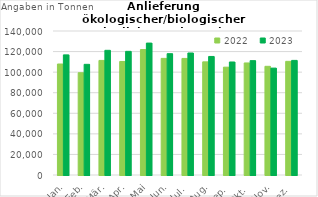
| Category | 2022 | 2023 |
|---|---|---|
| Jan. | 107909.282 | 116779.33 |
| Feb. | 99429.539 | 107594.545 |
| Mär. | 111392.152 | 121212.435 |
| Apr. | 110366.518 | 120208.989 |
| Mai | 121960.944 | 128253.711 |
| Jun. | 113379.179 | 117942.851 |
| Jul. | 113335.872 | 118612.122 |
| Aug. | 110008.158 | 115248.086 |
| Sep. | 104837.357 | 109871.811 |
| Okt. | 108927.433 | 111178.903 |
| Nov. | 105660.311 | 103910.089 |
| Dez. | 110488.674 | 111419.496 |